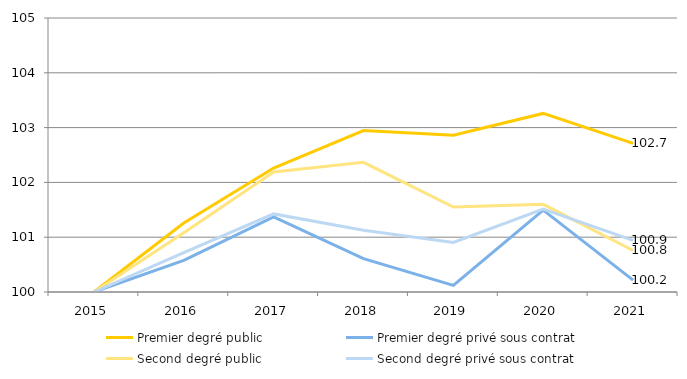
| Category | Premier degré public | Premier degré privé sous contrat | Second degré public | Second degré privé sous contrat |
|---|---|---|---|---|
| 2015.0 | 100 | 100 | 100 | 100 |
| 2016.0 | 101.26 | 100.577 | 101.082 | 100.721 |
| 2017.0 | 102.262 | 101.369 | 102.192 | 101.425 |
| 2018.0 | 102.947 | 100.608 | 102.366 | 101.126 |
| 2019.0 | 102.862 | 100.121 | 101.55 | 100.904 |
| 2020.0 | 103.259 | 101.494 | 101.6 | 101.514 |
| 2021.0 | 102.712 | 100.218 | 100.757 | 100.942 |